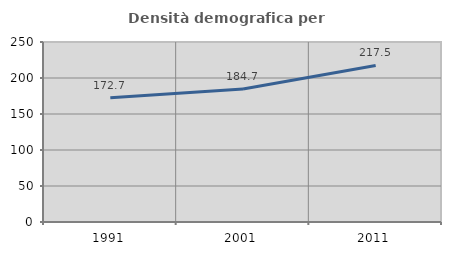
| Category | Densità demografica |
|---|---|
| 1991.0 | 172.73 |
| 2001.0 | 184.701 |
| 2011.0 | 217.459 |